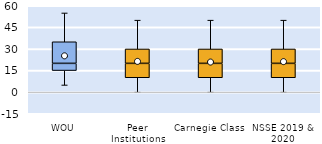
| Category | 25th | 50th | 75th |
|---|---|---|---|
| WOU | 15 | 5 | 15 |
| Peer Institutions | 10 | 10 | 10 |
| Carnegie Class | 10 | 10 | 10 |
| NSSE 2019 & 2020 | 10 | 10 | 10 |